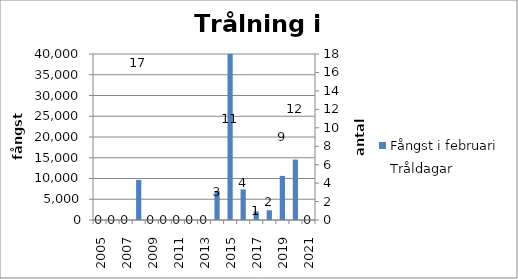
| Category | Fångst i februari |
|---|---|
| 2005.0 | 0 |
| 2006.0 | 0 |
| 2007.0 | 0 |
| 2008.0 | 9660 |
| 2009.0 | 0 |
| 2010.0 | 0 |
| 2011.0 | 0 |
| 2012.0 | 0 |
| 2013.0 | 0 |
| 2014.0 | 6992 |
| 2015.0 | 40661 |
| 2016.0 | 7377 |
| 2017.0 | 2050 |
| 2018.0 | 2350 |
| 2019.0 | 10623 |
| 2020.0 | 14555 |
| 2021.0 | 0 |